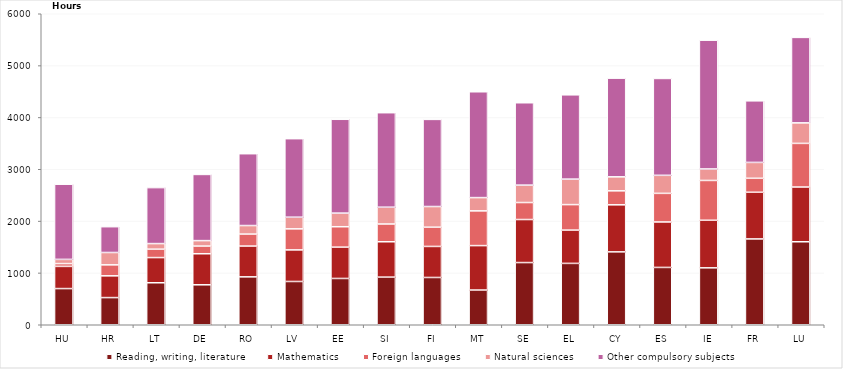
| Category | Reading, writing, literature | Mathematics | Foreign languages | Natural sciences | Other compulsory subjects |
|---|---|---|---|---|---|
| HU | 698 | 428 | 54 | 81 | 1450 |
| HR | 524 | 420 | 212 | 238 | 498 |
| LT | 810 | 486 | 162 | 108 | 1080 |
| DE | 771 | 599 | 148 | 105 | 1277 |
| RO | 924 | 594 | 231 | 165 | 1386 |
| LV | 835 | 609 | 406 | 225 | 1515 |
| EE | 893 | 604 | 394 | 263 | 1810 |
| SI | 919 | 682 | 343 | 324 | 1823 |
| FI | 912 | 599 | 371 | 399 | 1681 |
| MT | 670 | 857 | 670 | 256 | 2042 |
| SE | 1200 | 830 | 328 | 336 | 1589 |
| EL | 1184 | 642 | 492 | 492 | 1626 |
| CY | 1406 | 908 | 270 | 270 | 1904 |
| ES | 1106 | 877 | 552 | 348 | 1869 |
| IE | 1098 | 918 | 768 | 222 | 2484 |
| FR | 1656 | 900 | 270 | 306 | 1188 |
| LU | 1601 | 1056 | 842 | 396 | 1649 |